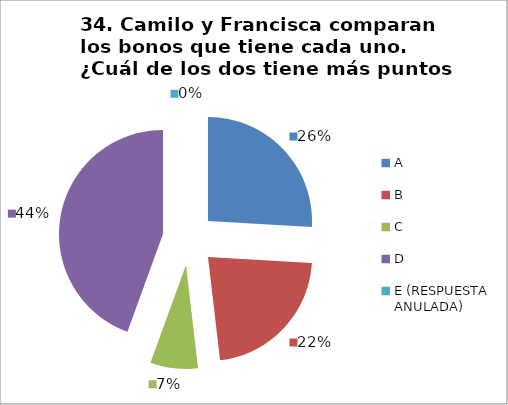
| Category | CANTIDAD DE RESPUESTAS PREGUNTA (34) | PORCENTAJE |
|---|---|---|
| A | 7 | 0.259 |
| B | 6 | 0.222 |
| C | 2 | 0.074 |
| D | 12 | 0.444 |
| E (RESPUESTA ANULADA) | 0 | 0 |